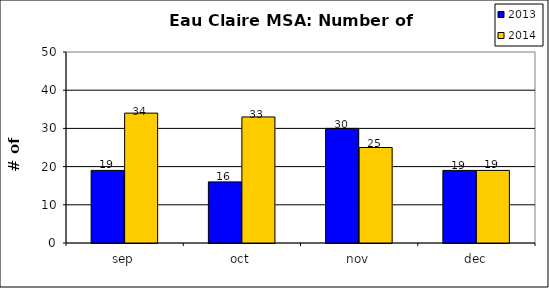
| Category | 2013 | 2014 |
|---|---|---|
| sep | 19 | 34 |
| oct | 16 | 33 |
| nov | 30 | 25 |
| dec | 19 | 19 |